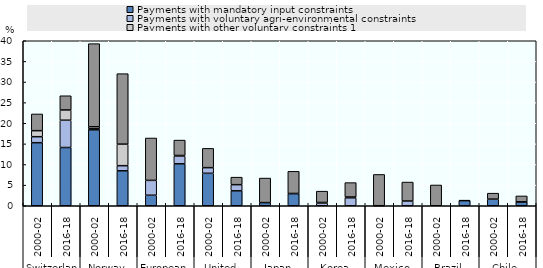
| Category | Payments with mandatory input constraints | Payments with voluntary agri-environmental constraints | Payments with other voluntary constraints 1 | Payments without input constraints |
|---|---|---|---|---|
| 0 | 15.291 | 1.451 | 1.461 | 4.051 |
| 1 | 14.119 | 6.619 | 2.483 | 3.448 |
| 2 | 18.415 | 0.238 | 0.5 | 20.147 |
| 3 | 8.471 | 1.243 | 5.224 | 17.083 |
| 4 | 2.552 | 3.601 | 0 | 10.272 |
| 5 | 10.167 | 1.9 | 0.122 | 3.731 |
| 6 | 7.871 | 1.367 | 0 | 4.672 |
| 7 | 3.617 | 1.495 | 0 | 1.822 |
| 8 | 0.76 | 0 | 0 | 5.95 |
| 9 | 2.957 | 0.023 | 0 | 5.367 |
| 10 | 0 | 0.67 | 0.129 | 2.742 |
| 11 | 0 | 1.923 | 0.199 | 3.489 |
| 12 | 0 | 0.011 | 0 | 7.577 |
| 13 | 0 | 1.147 | 0 | 4.598 |
| 14 | 0 | 0 | 0 | 5.035 |
| 15 | 1.24 | 0 | 0 | 0.083 |
| 16 | 1.611 | 0 | 0 | 1.438 |
| 17 | 0.954 | 0 | 0.004 | 1.424 |